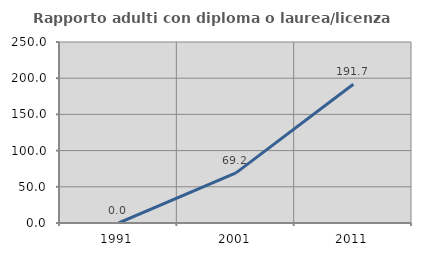
| Category | Rapporto adulti con diploma o laurea/licenza media  |
|---|---|
| 1991.0 | 0 |
| 2001.0 | 69.231 |
| 2011.0 | 191.667 |